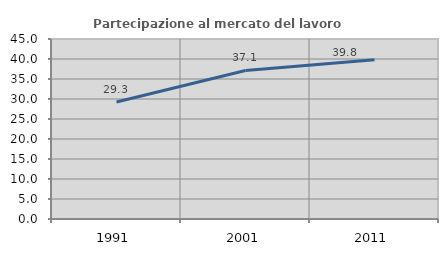
| Category | Partecipazione al mercato del lavoro  femminile |
|---|---|
| 1991.0 | 29.256 |
| 2001.0 | 37.139 |
| 2011.0 | 39.841 |